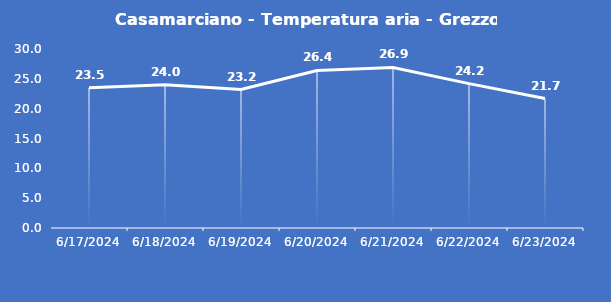
| Category | Casamarciano - Temperatura aria - Grezzo (°C) |
|---|---|
| 6/17/24 | 23.5 |
| 6/18/24 | 24 |
| 6/19/24 | 23.2 |
| 6/20/24 | 26.4 |
| 6/21/24 | 26.9 |
| 6/22/24 | 24.2 |
| 6/23/24 | 21.7 |